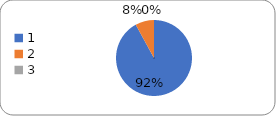
| Category | Series 0 |
|---|---|
| 0 | 104 |
| 1 | 9 |
| 2 | 0 |